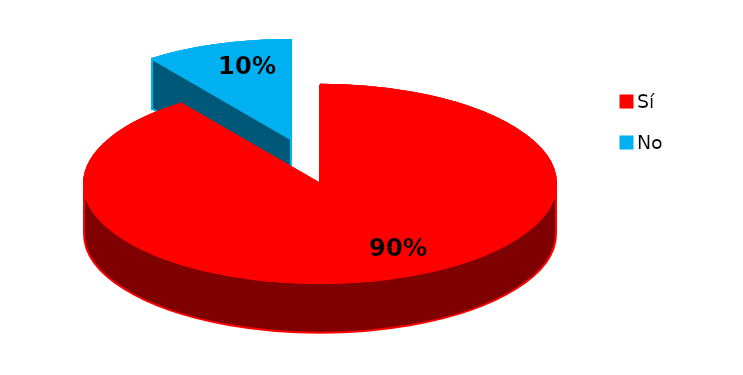
| Category | Series 0 |
|---|---|
| 0 | 18 |
| 1 | 2 |